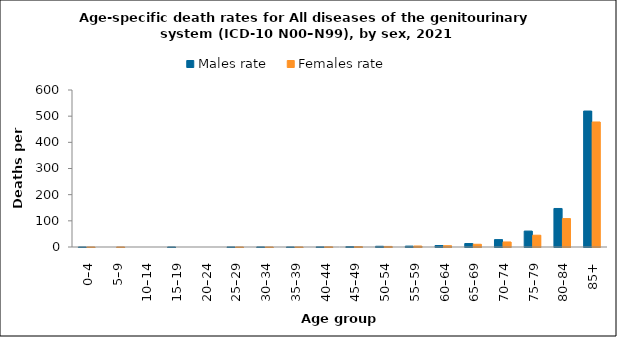
| Category | Males rate | Females rate |
|---|---|---|
| 0–4 | 0.129 | 0.136 |
| 5–9 | 0 | 0.127 |
| 10–14 | 0 | 0 |
| 15–19 | 0.131 | 0 |
| 20–24 | 0 | 0 |
| 25–29 | 0.218 | 0.111 |
| 30–34 | 0.319 | 0.104 |
| 35–39 | 0.215 | 0.213 |
| 40–44 | 0.49 | 0.715 |
| 45–49 | 1.468 | 1.441 |
| 50–54 | 2.77 | 2.202 |
| 55–59 | 3.41 | 3.807 |
| 60–64 | 5.624 | 4.908 |
| 65–69 | 13.279 | 10.413 |
| 70–74 | 28.304 | 19.254 |
| 75–79 | 60.85 | 45.069 |
| 80–84 | 147.222 | 108.649 |
| 85+ | 519.594 | 477.81 |